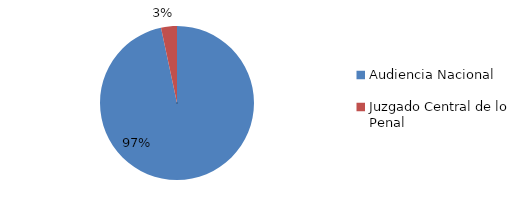
| Category | Series 0 |
|---|---|
| Audiencia Nacional | 29 |
| Juzgado Central de lo Penal | 1 |